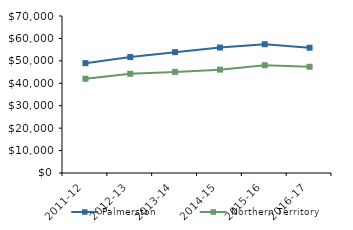
| Category | Palmerston | Northern Territory |
|---|---|---|
| 2011-12 | 48981.47 | 42021 |
| 2012-13 | 51694.55 | 44232.02 |
| 2013-14 | 53880.53 | 45075.51 |
| 2014-15 | 55936 | 46083.65 |
| 2015-16 | 57425.2 | 48046.27 |
| 2016-17 | 55851.02 | 47367.05 |